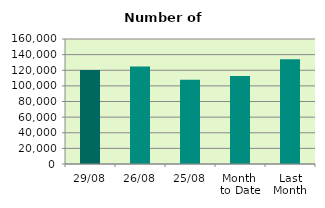
| Category | Series 0 |
|---|---|
| 29/08 | 120398 |
| 26/08 | 124672 |
| 25/08 | 107788 |
| Month 
to Date | 112643.048 |
| Last
Month | 134197.333 |